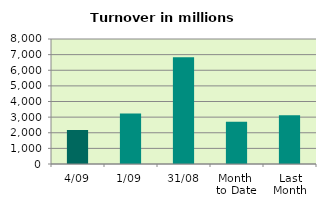
| Category | Series 0 |
|---|---|
| 4/09 | 2175.012 |
| 1/09 | 3227.714 |
| 31/08 | 6834.59 |
| Month 
to Date | 2701.363 |
| Last
Month | 3127.739 |